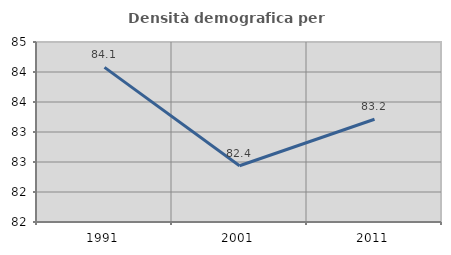
| Category | Densità demografica |
|---|---|
| 1991.0 | 84.078 |
| 2001.0 | 82.437 |
| 2011.0 | 83.212 |